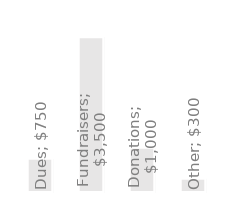
| Category | Yearly Revenue |
|---|---|
| Dues | 750 |
| Fundraisers | 3500 |
| Donations | 1000 |
| Other | 300 |